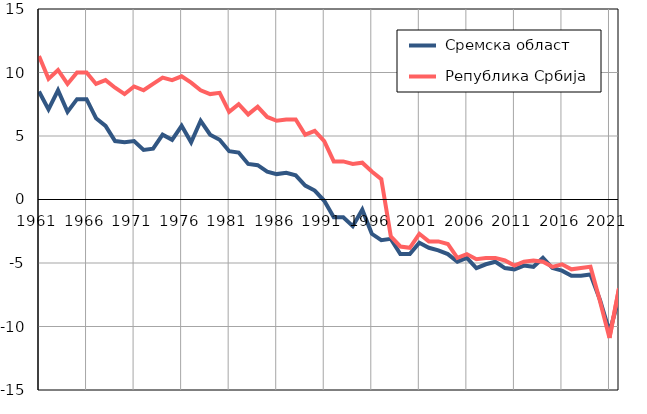
| Category |  Сремска област |  Република Србија |
|---|---|---|
| 1961.0 | 8.5 | 11.3 |
| 1962.0 | 7.1 | 9.5 |
| 1963.0 | 8.6 | 10.2 |
| 1964.0 | 6.9 | 9.1 |
| 1965.0 | 7.9 | 10 |
| 1966.0 | 7.9 | 10 |
| 1967.0 | 6.4 | 9.1 |
| 1968.0 | 5.8 | 9.4 |
| 1969.0 | 4.6 | 8.8 |
| 1970.0 | 4.5 | 8.3 |
| 1971.0 | 4.6 | 8.9 |
| 1972.0 | 3.9 | 8.6 |
| 1973.0 | 4 | 9.1 |
| 1974.0 | 5.1 | 9.6 |
| 1975.0 | 4.7 | 9.4 |
| 1976.0 | 5.8 | 9.7 |
| 1977.0 | 4.5 | 9.2 |
| 1978.0 | 6.2 | 8.6 |
| 1979.0 | 5.1 | 8.3 |
| 1980.0 | 4.7 | 8.4 |
| 1981.0 | 3.8 | 6.9 |
| 1982.0 | 3.7 | 7.5 |
| 1983.0 | 2.8 | 6.7 |
| 1984.0 | 2.7 | 7.3 |
| 1985.0 | 2.2 | 6.5 |
| 1986.0 | 2 | 6.2 |
| 1987.0 | 2.1 | 6.3 |
| 1988.0 | 1.9 | 6.3 |
| 1989.0 | 1.1 | 5.1 |
| 1990.0 | 0.7 | 5.4 |
| 1991.0 | -0.1 | 4.6 |
| 1992.0 | -1.4 | 3 |
| 1993.0 | -1.4 | 3 |
| 1994.0 | -2.1 | 2.8 |
| 1995.0 | -0.8 | 2.9 |
| 1996.0 | -2.7 | 2.2 |
| 1997.0 | -3.2 | 1.6 |
| 1998.0 | -3.1 | -2.9 |
| 1999.0 | -4.3 | -3.7 |
| 2000.0 | -4.3 | -3.8 |
| 2001.0 | -3.4 | -2.7 |
| 2002.0 | -3.8 | -3.3 |
| 2003.0 | -4 | -3.3 |
| 2004.0 | -4.3 | -3.5 |
| 2005.0 | -4.9 | -4.6 |
| 2006.0 | -4.6 | -4.3 |
| 2007.0 | -5.4 | -4.7 |
| 2008.0 | -5.1 | -4.6 |
| 2009.0 | -4.9 | -4.6 |
| 2010.0 | -5.4 | -4.8 |
| 2011.0 | -5.5 | -5.2 |
| 2012.0 | -5.2 | -4.9 |
| 2013.0 | -5.3 | -4.8 |
| 2014.0 | -4.6 | -4.9 |
| 2015.0 | -5.4 | -5.3 |
| 2016.0 | -5.6 | -5.1 |
| 2017.0 | -6 | -5.5 |
| 2018.0 | -6 | -5.4 |
| 2019.0 | -5.9 | -5.3 |
| 2020.0 | -7.9 | -8 |
| 2021.0 | -10.4 | -10.9 |
| 2022.0 | -7.8 | -7 |